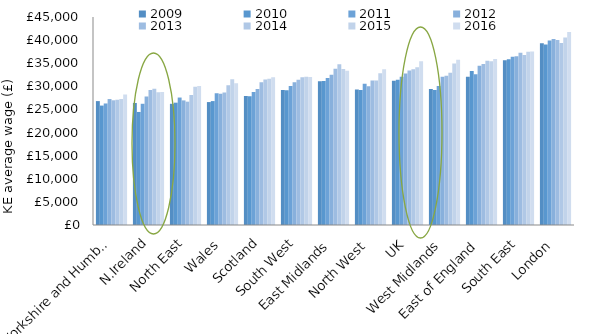
| Category | 2009 | 2010 | 2011 | 2012 | 2013 | 2014 | 2015 | 2016 |
|---|---|---|---|---|---|---|---|---|
| Yorkshire and Humber | 26805 | 25836 | 26291 | 27250 | 26977 | 27098 | 27252 | 28240 |
| N.Ireland | 26406 | 24455 | 26226 | 27824 | 29196 | 29469 | 28724 | 28798 |
| North East | 26222 | 26463 | 27575 | 26958 | 26682 | 28150 | 29894 | 30098 |
| Wales | 26595 | 26808 | 28489 | 28404 | 28664 | 30234 | 31516 | 30689 |
| Scotland | 27930 | 27830 | 28797 | 29402 | 30865 | 31477 | 31667 | 31946 |
| South West | 29228 | 29138 | 30058 | 30899 | 31403 | 31990 | 32078 | 32032 |
| East Midlands | 31073 | 31174 | 31808 | 32484 | 33824 | 34801 | 33764 | 33392 |
| North West | 29294 | 29230 | 30547 | 30011 | 31262 | 31267 | 32821 | 33713 |
| UK | 31190 | 31421 | 32069 | 32750 | 33419 | 33698 | 34115 | 35408.153 |
| West Midlands | 29403 | 29229 | 30093 | 32073 | 32270 | 32919 | 34919 | 35765 |
| East of England | 32066 | 33322 | 32605 | 34471 | 34831 | 35514 | 35441 | 35924 |
| South East | 35628 | 35835 | 36423 | 36514 | 37287 | 36769 | 37490 | 37526 |
| London | 39300 | 39077 | 39900 | 40250 | 40000 | 39393 | 40546 | 41766 |